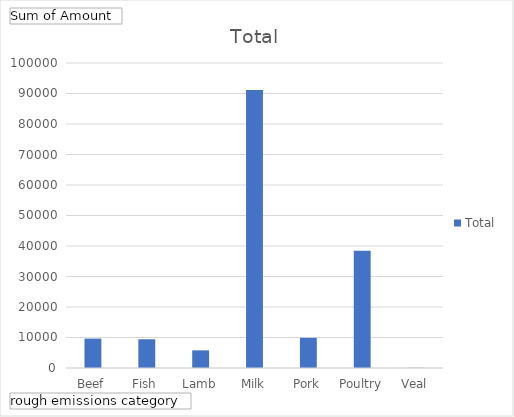
| Category | Total |
|---|---|
| Beef | 9632.049 |
| Fish | 9423.096 |
| Lamb | 5781.096 |
| Milk | 91183.62 |
| Pork | 9882.94 |
| Poultry | 38433.991 |
| Veal | 80.4 |